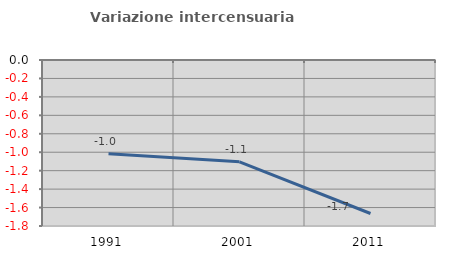
| Category | Variazione intercensuaria annua |
|---|---|
| 1991.0 | -1.018 |
| 2001.0 | -1.104 |
| 2011.0 | -1.665 |